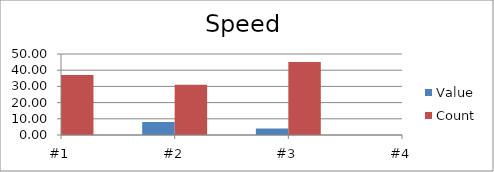
| Category | Value | Count |
|---|---|---|
| #1 | 10 | 37 |
| #2 | 8 | 31 |
| #3 | 4 | 45 |
| #4 | 0 | 45 |